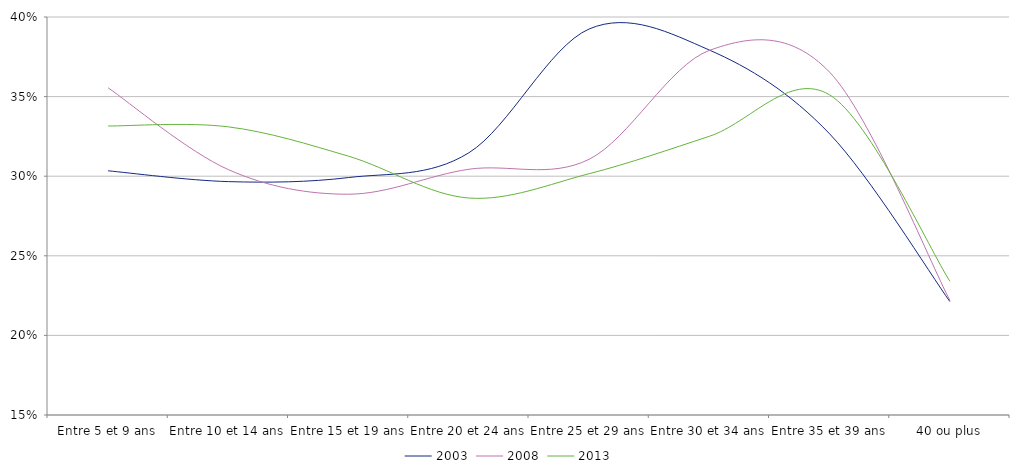
| Category | 2003 | 2008 | 2013 |
|---|---|---|---|
| Entre 5 et 9 ans | 0.303 | 0.356 | 0.332 |
| Entre 10 et 14 ans | 0.297 | 0.304 | 0.331 |
| Entre 15 et 19 ans | 0.299 | 0.289 | 0.313 |
| Entre 20 et 24 ans | 0.315 | 0.304 | 0.286 |
| Entre 25 et 29 ans | 0.392 | 0.311 | 0.302 |
| Entre 30 et 34 ans | 0.379 | 0.379 | 0.325 |
| Entre 35 et 39 ans | 0.327 | 0.365 | 0.351 |
| 40 ou plus | 0.221 | 0.222 | 0.234 |